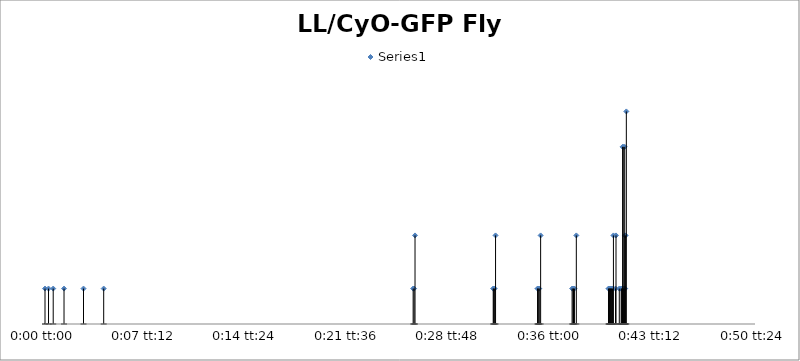
| Category | Series 0 |
|---|---|
| 0.0 | 2 |
| 0.00017361111111113825 | 2 |
| 0.00040509259259260966 | 2 |
| 0.0009375000000000078 | 2 |
| 0.0018981481481481488 | 2 |
| 0.0028935185185185452 | 2 |
| 0.018148148148148163 | 2 |
| 0.018194444444444458 | 2 |
| 0.018240740740740724 | 5 |
| 0.02209490740740741 | 2 |
| 0.02211805555555557 | 2 |
| 0.022164351851851866 | 2 |
| 0.02221064814814816 | 5 |
| 0.02428240740740742 | 2 |
| 0.024293981481481486 | 2 |
| 0.024340277777777808 | 2 |
| 0.02436342592592594 | 2 |
| 0.02443287037037037 | 5 |
| 0.025983796296296324 | 2 |
| 0.02603009259259262 | 2 |
| 0.026053240740740724 | 2 |
| 0.026099537037037046 | 2 |
| 0.026192129629629635 | 5 |
| 0.02777777777777779 | 2 |
| 0.027800925925925923 | 2 |
| 0.027824074074074084 | 2 |
| 0.027847222222222245 | 2 |
| 0.02787037037037038 | 2 |
| 0.02789351851851854 | 2 |
| 0.0279166666666667 | 2 |
| 0.027939814814814834 | 2 |
| 0.027974537037037034 | 2 |
| 0.028020833333333328 | 5 |
| 0.02812500000000001 | 2 |
| 0.028148148148148172 | 5 |
| 0.028310185185185188 | 2 |
| 0.028402777777777805 | 2 |
| 0.02842592592592591 | 2 |
| 0.028460648148148138 | 2 |
| 0.028472222222222232 | 10 |
| 0.028495370370370365 | 2 |
| 0.02850694444444446 | 10 |
| 0.028530092592592593 | 2 |
| 0.028553240740740754 | 2 |
| 0.028576388888888915 | 10 |
| 0.02858796296296298 | 5 |
| 0.02859953703703705 | 2 |
| 0.02862268518518521 | 5 |
| 0.02865740740740741 | 12 |